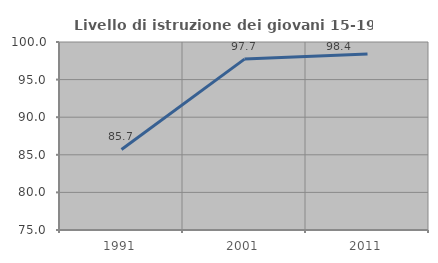
| Category | Livello di istruzione dei giovani 15-19 anni |
|---|---|
| 1991.0 | 85.714 |
| 2001.0 | 97.727 |
| 2011.0 | 98.413 |